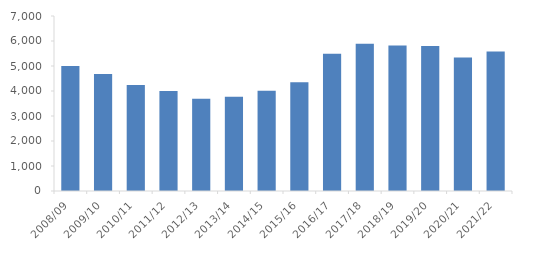
| Category | Iscritti serali |
|---|---|
| 2008/09 | 4999 |
| 2009/10 | 4675 |
| 2010/11 | 4245 |
| 2011/12 | 3996 |
| 2012/13 | 3693 |
| 2013/14 | 3774 |
| 2014/15 | 4006 |
| 2015/16 | 4346 |
| 2016/17 | 5495 |
| 2017/18 | 5888 |
| 2018/19 | 5821 |
| 2019/20 | 5803 |
| 2020/21 | 5345 |
| 2021/22 | 5582 |